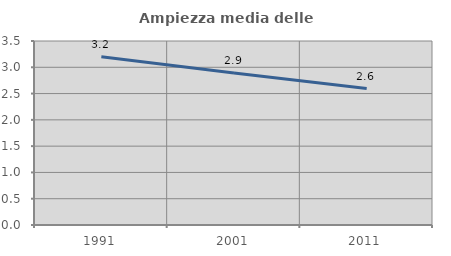
| Category | Ampiezza media delle famiglie |
|---|---|
| 1991.0 | 3.201 |
| 2001.0 | 2.889 |
| 2011.0 | 2.596 |